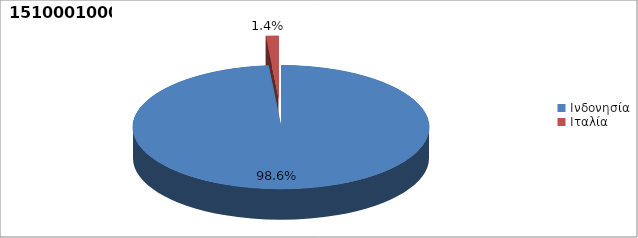
| Category | Series 0 |
|---|---|
| Ινδονησία | 0.986 |
| Ιταλία | 0.014 |